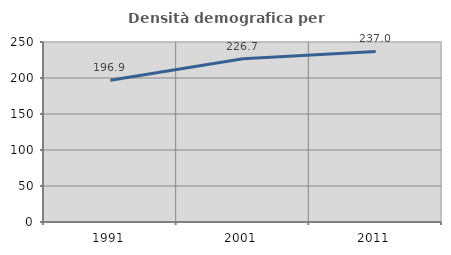
| Category | Densità demografica |
|---|---|
| 1991.0 | 196.854 |
| 2001.0 | 226.708 |
| 2011.0 | 236.96 |